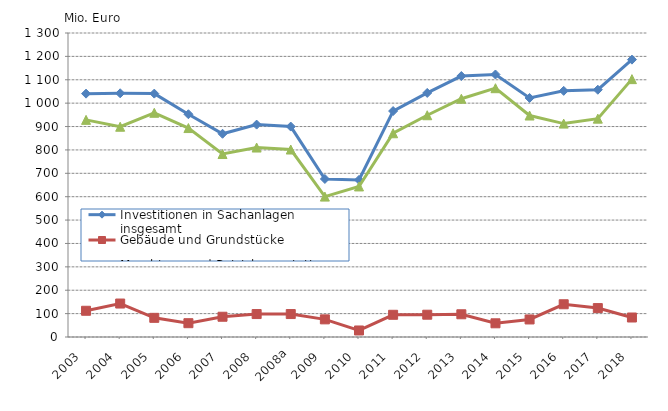
| Category | Investitionen in Sachanlagen insgesamt | Gebäude und Grundstücke | Maschinen und Betriebsausstattung |
|---|---|---|---|
| 2003  | 1040673 | 112131 | 928542 |
| 2004  | 1042199 | 143093 | 899107 |
| 2005  | 1040771 | 81943 | 958828 |
| 2006  | 952585 | 59050 | 893535 |
| 2007  | 869086 | 86618 | 782467 |
| 2008  | 908294 | 98112 | 810182 |
| 2008a | 899839 | 98112 | 801727 |
| 2009  | 675811 | 75418 | 600393 |
| 2010  | 671734.109 | 27895.396 | 643838.713 |
| 2011  | 966215.121 | 94979.882 | 871235.239 |
| 2012  | 1043637.405 | 95334.066 | 948303.339 |
| 2013  | 1115956.006 | 97198.2 | 1018757.806 |
| 2014  | 1122553.349 | 58554.558 | 1063998.791 |
| 2015  | 1022095.197 | 75014.669 | 947080.528 |
| 2016  | 1052570.21 | 139988.972 | 912581.238 |
| 2017  | 1057379.348 | 123665.469 | 933713.879 |
| 2018  | 1186108.837 | 83370.127 | 1102738.71 |